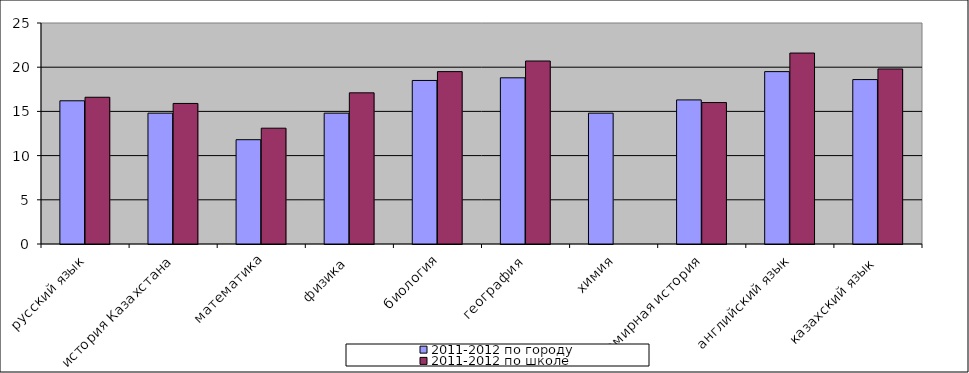
| Category | 2011-2012 по городу | 2011-2012 по школе |
|---|---|---|
| русский язык | 16.2 | 16.6 |
| история Казахстана | 14.8 | 15.9 |
| математика | 11.8 | 13.1 |
| физика | 14.8 | 17.1 |
| биология | 18.5 | 19.5 |
| география | 18.8 | 20.7 |
| химия | 14.8 | 0 |
| всемирная история | 16.3 | 16 |
| английский язык | 19.5 | 21.6 |
| казахский язык | 18.6 | 19.8 |